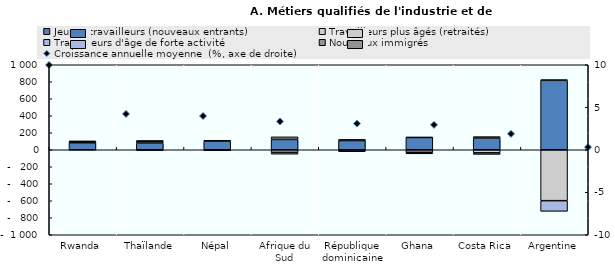
| Category | Jeunes travailleurs (nouveaux entrants) | Travailleurs plus âgés (retraités) | Travailleurs d'âge de forte activité | Nouveaux immigrés |
|---|---|---|---|---|
| Rwanda | 82.842 | -0.455 | 15.354 | 2.259 |
| Thaïlande | 77.118 | -9.4 | 16.395 | 15.888 |
| Népal | 103.037 | -11.626 | 2.669 | 5.92 |
| Afrique du Sud | 121.407 | -30.833 | -21.157 | 30.584 |
| République dominicaine | 108.012 | -16.666 | -5.43 | 14.083 |
| Ghana | 144.588 | -29.649 | -17.988 | 3.049 |
| Costa Rica | 137.212 | -36.305 | -18.574 | 17.666 |
| Argentine | 816.663 | -599.034 | -125.287 | 7.658 |